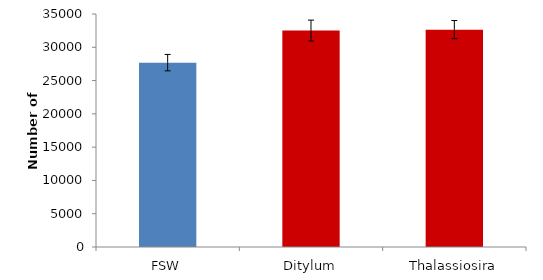
| Category | Series 0 |
|---|---|
| FSW | 27692.756 |
| Ditylum | 32514.795 |
| Thalassiosira | 32652.267 |